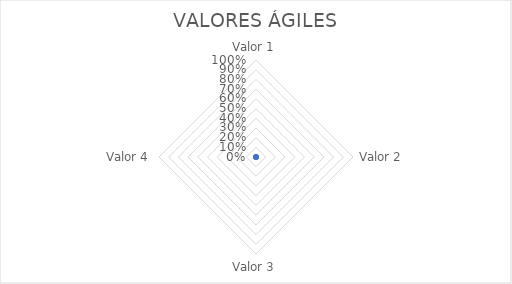
| Category | TOTAL |
|---|---|
| Valor 1 | 0 |
| Valor 2 | 0 |
| Valor 3 | 0 |
| Valor 4 | 0 |